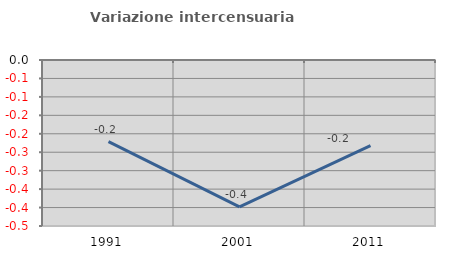
| Category | Variazione intercensuaria annua |
|---|---|
| 1991.0 | -0.221 |
| 2001.0 | -0.398 |
| 2011.0 | -0.232 |